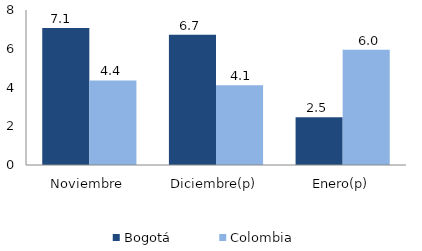
| Category | Bogotá | Colombia |
|---|---|---|
| Noviembre | 7.073 | 4.365 |
| Diciembre(p) | 6.719 | 4.114 |
| Enero(p) | 2.466 | 5.953 |